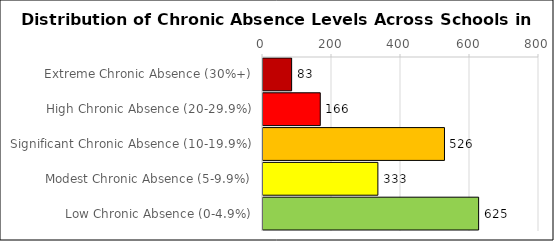
| Category | Number of Schools |
|---|---|
| Extreme Chronic Absence (30%+) | 83 |
| High Chronic Absence (20-29.9%) | 166 |
| Significant Chronic Absence (10-19.9%) | 526 |
| Modest Chronic Absence (5-9.9%) | 333 |
| Low Chronic Absence (0-4.9%) | 625 |